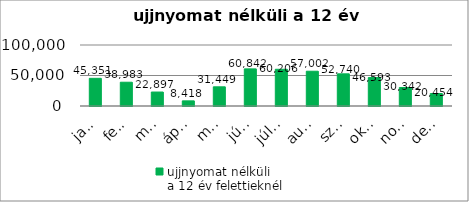
| Category | ujjnyomat nélküli 
a 12 év felettieknél |
|---|---|
| január | 45351 |
| február | 38983 |
| március | 22897 |
| április | 8418 |
| május | 31449 |
| június | 60842 |
| július | 60206 |
| augusztus | 57002 |
| szeptember | 52740 |
| október | 46593 |
| november | 30342 |
| december | 20454 |